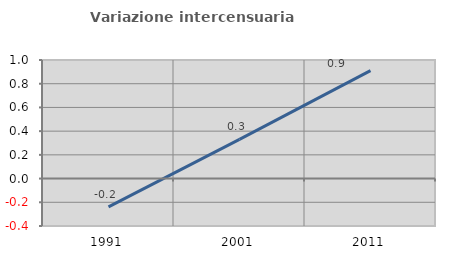
| Category | Variazione intercensuaria annua |
|---|---|
| 1991.0 | -0.239 |
| 2001.0 | 0.331 |
| 2011.0 | 0.911 |